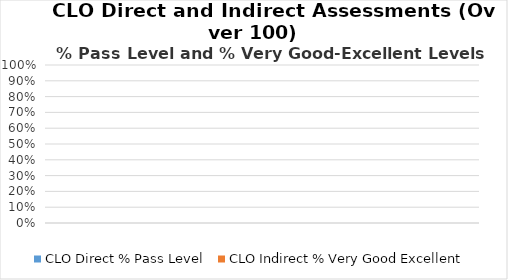
| Category | CLO Direct % Pass Level | CLO Indirect % Very Good Excellent |
|---|---|---|
| 0 | 0 | 0 |
| 1 | 0 | 0 |
| 2 | 0 | 0 |
| 3 | 0 | 0 |
| 4 | 0 | 0 |
| 5 | 0 | 0 |
| 6 | 0 | 0 |
| 7 | 0 | 0 |
| 8 | 0 | 0 |
| 9 | 0 | 0 |